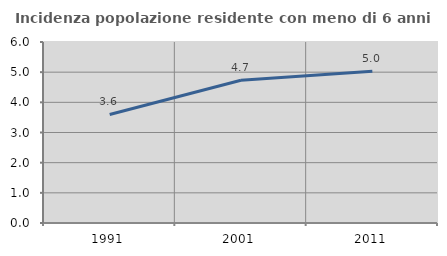
| Category | Incidenza popolazione residente con meno di 6 anni |
|---|---|
| 1991.0 | 3.597 |
| 2001.0 | 4.73 |
| 2011.0 | 5.031 |